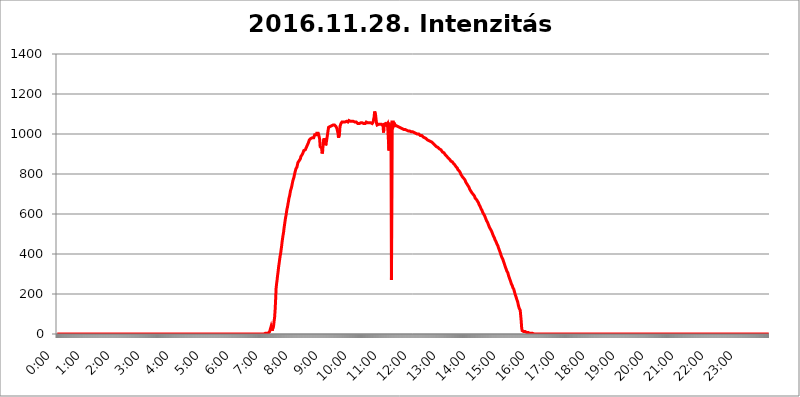
| Category | 2016.11.28. Intenzitás [W/m^2] |
|---|---|
| 0.0 | 0 |
| 0.0006944444444444445 | 0 |
| 0.001388888888888889 | 0 |
| 0.0020833333333333333 | 0 |
| 0.002777777777777778 | 0 |
| 0.003472222222222222 | 0 |
| 0.004166666666666667 | 0 |
| 0.004861111111111111 | 0 |
| 0.005555555555555556 | 0 |
| 0.0062499999999999995 | 0 |
| 0.006944444444444444 | 0 |
| 0.007638888888888889 | 0 |
| 0.008333333333333333 | 0 |
| 0.009027777777777779 | 0 |
| 0.009722222222222222 | 0 |
| 0.010416666666666666 | 0 |
| 0.011111111111111112 | 0 |
| 0.011805555555555555 | 0 |
| 0.012499999999999999 | 0 |
| 0.013194444444444444 | 0 |
| 0.013888888888888888 | 0 |
| 0.014583333333333332 | 0 |
| 0.015277777777777777 | 0 |
| 0.015972222222222224 | 0 |
| 0.016666666666666666 | 0 |
| 0.017361111111111112 | 0 |
| 0.018055555555555557 | 0 |
| 0.01875 | 0 |
| 0.019444444444444445 | 0 |
| 0.02013888888888889 | 0 |
| 0.020833333333333332 | 0 |
| 0.02152777777777778 | 0 |
| 0.022222222222222223 | 0 |
| 0.02291666666666667 | 0 |
| 0.02361111111111111 | 0 |
| 0.024305555555555556 | 0 |
| 0.024999999999999998 | 0 |
| 0.025694444444444447 | 0 |
| 0.02638888888888889 | 0 |
| 0.027083333333333334 | 0 |
| 0.027777777777777776 | 0 |
| 0.02847222222222222 | 0 |
| 0.029166666666666664 | 0 |
| 0.029861111111111113 | 0 |
| 0.030555555555555555 | 0 |
| 0.03125 | 0 |
| 0.03194444444444445 | 0 |
| 0.03263888888888889 | 0 |
| 0.03333333333333333 | 0 |
| 0.034027777777777775 | 0 |
| 0.034722222222222224 | 0 |
| 0.035416666666666666 | 0 |
| 0.036111111111111115 | 0 |
| 0.03680555555555556 | 0 |
| 0.0375 | 0 |
| 0.03819444444444444 | 0 |
| 0.03888888888888889 | 0 |
| 0.03958333333333333 | 0 |
| 0.04027777777777778 | 0 |
| 0.04097222222222222 | 0 |
| 0.041666666666666664 | 0 |
| 0.042361111111111106 | 0 |
| 0.04305555555555556 | 0 |
| 0.043750000000000004 | 0 |
| 0.044444444444444446 | 0 |
| 0.04513888888888889 | 0 |
| 0.04583333333333334 | 0 |
| 0.04652777777777778 | 0 |
| 0.04722222222222222 | 0 |
| 0.04791666666666666 | 0 |
| 0.04861111111111111 | 0 |
| 0.049305555555555554 | 0 |
| 0.049999999999999996 | 0 |
| 0.05069444444444445 | 0 |
| 0.051388888888888894 | 0 |
| 0.052083333333333336 | 0 |
| 0.05277777777777778 | 0 |
| 0.05347222222222222 | 0 |
| 0.05416666666666667 | 0 |
| 0.05486111111111111 | 0 |
| 0.05555555555555555 | 0 |
| 0.05625 | 0 |
| 0.05694444444444444 | 0 |
| 0.057638888888888885 | 0 |
| 0.05833333333333333 | 0 |
| 0.05902777777777778 | 0 |
| 0.059722222222222225 | 0 |
| 0.06041666666666667 | 0 |
| 0.061111111111111116 | 0 |
| 0.06180555555555556 | 0 |
| 0.0625 | 0 |
| 0.06319444444444444 | 0 |
| 0.06388888888888888 | 0 |
| 0.06458333333333334 | 0 |
| 0.06527777777777778 | 0 |
| 0.06597222222222222 | 0 |
| 0.06666666666666667 | 0 |
| 0.06736111111111111 | 0 |
| 0.06805555555555555 | 0 |
| 0.06874999999999999 | 0 |
| 0.06944444444444443 | 0 |
| 0.07013888888888889 | 0 |
| 0.07083333333333333 | 0 |
| 0.07152777777777779 | 0 |
| 0.07222222222222223 | 0 |
| 0.07291666666666667 | 0 |
| 0.07361111111111111 | 0 |
| 0.07430555555555556 | 0 |
| 0.075 | 0 |
| 0.07569444444444444 | 0 |
| 0.0763888888888889 | 0 |
| 0.07708333333333334 | 0 |
| 0.07777777777777778 | 0 |
| 0.07847222222222222 | 0 |
| 0.07916666666666666 | 0 |
| 0.0798611111111111 | 0 |
| 0.08055555555555556 | 0 |
| 0.08125 | 0 |
| 0.08194444444444444 | 0 |
| 0.08263888888888889 | 0 |
| 0.08333333333333333 | 0 |
| 0.08402777777777777 | 0 |
| 0.08472222222222221 | 0 |
| 0.08541666666666665 | 0 |
| 0.08611111111111112 | 0 |
| 0.08680555555555557 | 0 |
| 0.08750000000000001 | 0 |
| 0.08819444444444445 | 0 |
| 0.08888888888888889 | 0 |
| 0.08958333333333333 | 0 |
| 0.09027777777777778 | 0 |
| 0.09097222222222222 | 0 |
| 0.09166666666666667 | 0 |
| 0.09236111111111112 | 0 |
| 0.09305555555555556 | 0 |
| 0.09375 | 0 |
| 0.09444444444444444 | 0 |
| 0.09513888888888888 | 0 |
| 0.09583333333333333 | 0 |
| 0.09652777777777777 | 0 |
| 0.09722222222222222 | 0 |
| 0.09791666666666667 | 0 |
| 0.09861111111111111 | 0 |
| 0.09930555555555555 | 0 |
| 0.09999999999999999 | 0 |
| 0.10069444444444443 | 0 |
| 0.1013888888888889 | 0 |
| 0.10208333333333335 | 0 |
| 0.10277777777777779 | 0 |
| 0.10347222222222223 | 0 |
| 0.10416666666666667 | 0 |
| 0.10486111111111111 | 0 |
| 0.10555555555555556 | 0 |
| 0.10625 | 0 |
| 0.10694444444444444 | 0 |
| 0.1076388888888889 | 0 |
| 0.10833333333333334 | 0 |
| 0.10902777777777778 | 0 |
| 0.10972222222222222 | 0 |
| 0.1111111111111111 | 0 |
| 0.11180555555555556 | 0 |
| 0.11180555555555556 | 0 |
| 0.1125 | 0 |
| 0.11319444444444444 | 0 |
| 0.11388888888888889 | 0 |
| 0.11458333333333333 | 0 |
| 0.11527777777777777 | 0 |
| 0.11597222222222221 | 0 |
| 0.11666666666666665 | 0 |
| 0.1173611111111111 | 0 |
| 0.11805555555555557 | 0 |
| 0.11944444444444445 | 0 |
| 0.12013888888888889 | 0 |
| 0.12083333333333333 | 0 |
| 0.12152777777777778 | 0 |
| 0.12222222222222223 | 0 |
| 0.12291666666666667 | 0 |
| 0.12291666666666667 | 0 |
| 0.12361111111111112 | 0 |
| 0.12430555555555556 | 0 |
| 0.125 | 0 |
| 0.12569444444444444 | 0 |
| 0.12638888888888888 | 0 |
| 0.12708333333333333 | 0 |
| 0.16875 | 0 |
| 0.12847222222222224 | 0 |
| 0.12916666666666668 | 0 |
| 0.12986111111111112 | 0 |
| 0.13055555555555556 | 0 |
| 0.13125 | 0 |
| 0.13194444444444445 | 0 |
| 0.1326388888888889 | 0 |
| 0.13333333333333333 | 0 |
| 0.13402777777777777 | 0 |
| 0.13402777777777777 | 0 |
| 0.13472222222222222 | 0 |
| 0.13541666666666666 | 0 |
| 0.1361111111111111 | 0 |
| 0.13749999999999998 | 0 |
| 0.13819444444444443 | 0 |
| 0.1388888888888889 | 0 |
| 0.13958333333333334 | 0 |
| 0.14027777777777778 | 0 |
| 0.14097222222222222 | 0 |
| 0.14166666666666666 | 0 |
| 0.1423611111111111 | 0 |
| 0.14305555555555557 | 0 |
| 0.14375000000000002 | 0 |
| 0.14444444444444446 | 0 |
| 0.1451388888888889 | 0 |
| 0.1451388888888889 | 0 |
| 0.14652777777777778 | 0 |
| 0.14722222222222223 | 0 |
| 0.14791666666666667 | 0 |
| 0.1486111111111111 | 0 |
| 0.14930555555555555 | 0 |
| 0.15 | 0 |
| 0.15069444444444444 | 0 |
| 0.15138888888888888 | 0 |
| 0.15208333333333332 | 0 |
| 0.15277777777777776 | 0 |
| 0.15347222222222223 | 0 |
| 0.15416666666666667 | 0 |
| 0.15486111111111112 | 0 |
| 0.15555555555555556 | 0 |
| 0.15625 | 0 |
| 0.15694444444444444 | 0 |
| 0.15763888888888888 | 0 |
| 0.15833333333333333 | 0 |
| 0.15902777777777777 | 0 |
| 0.15972222222222224 | 0 |
| 0.16041666666666668 | 0 |
| 0.16111111111111112 | 0 |
| 0.16180555555555556 | 0 |
| 0.1625 | 0 |
| 0.16319444444444445 | 0 |
| 0.1638888888888889 | 0 |
| 0.16458333333333333 | 0 |
| 0.16527777777777777 | 0 |
| 0.16597222222222222 | 0 |
| 0.16666666666666666 | 0 |
| 0.1673611111111111 | 0 |
| 0.16805555555555554 | 0 |
| 0.16874999999999998 | 0 |
| 0.16944444444444443 | 0 |
| 0.17013888888888887 | 0 |
| 0.1708333333333333 | 0 |
| 0.17152777777777775 | 0 |
| 0.17222222222222225 | 0 |
| 0.1729166666666667 | 0 |
| 0.17361111111111113 | 0 |
| 0.17430555555555557 | 0 |
| 0.17500000000000002 | 0 |
| 0.17569444444444446 | 0 |
| 0.1763888888888889 | 0 |
| 0.17708333333333334 | 0 |
| 0.17777777777777778 | 0 |
| 0.17847222222222223 | 0 |
| 0.17916666666666667 | 0 |
| 0.1798611111111111 | 0 |
| 0.18055555555555555 | 0 |
| 0.18125 | 0 |
| 0.18194444444444444 | 0 |
| 0.1826388888888889 | 0 |
| 0.18333333333333335 | 0 |
| 0.1840277777777778 | 0 |
| 0.18472222222222223 | 0 |
| 0.18541666666666667 | 0 |
| 0.18611111111111112 | 0 |
| 0.18680555555555556 | 0 |
| 0.1875 | 0 |
| 0.18819444444444444 | 0 |
| 0.18888888888888888 | 0 |
| 0.18958333333333333 | 0 |
| 0.19027777777777777 | 0 |
| 0.1909722222222222 | 0 |
| 0.19166666666666665 | 0 |
| 0.19236111111111112 | 0 |
| 0.19305555555555554 | 0 |
| 0.19375 | 0 |
| 0.19444444444444445 | 0 |
| 0.1951388888888889 | 0 |
| 0.19583333333333333 | 0 |
| 0.19652777777777777 | 0 |
| 0.19722222222222222 | 0 |
| 0.19791666666666666 | 0 |
| 0.1986111111111111 | 0 |
| 0.19930555555555554 | 0 |
| 0.19999999999999998 | 0 |
| 0.20069444444444443 | 0 |
| 0.20138888888888887 | 0 |
| 0.2020833333333333 | 0 |
| 0.2027777777777778 | 0 |
| 0.2034722222222222 | 0 |
| 0.2041666666666667 | 0 |
| 0.20486111111111113 | 0 |
| 0.20555555555555557 | 0 |
| 0.20625000000000002 | 0 |
| 0.20694444444444446 | 0 |
| 0.2076388888888889 | 0 |
| 0.20833333333333334 | 0 |
| 0.20902777777777778 | 0 |
| 0.20972222222222223 | 0 |
| 0.21041666666666667 | 0 |
| 0.2111111111111111 | 0 |
| 0.21180555555555555 | 0 |
| 0.2125 | 0 |
| 0.21319444444444444 | 0 |
| 0.2138888888888889 | 0 |
| 0.21458333333333335 | 0 |
| 0.2152777777777778 | 0 |
| 0.21597222222222223 | 0 |
| 0.21666666666666667 | 0 |
| 0.21736111111111112 | 0 |
| 0.21805555555555556 | 0 |
| 0.21875 | 0 |
| 0.21944444444444444 | 0 |
| 0.22013888888888888 | 0 |
| 0.22083333333333333 | 0 |
| 0.22152777777777777 | 0 |
| 0.2222222222222222 | 0 |
| 0.22291666666666665 | 0 |
| 0.2236111111111111 | 0 |
| 0.22430555555555556 | 0 |
| 0.225 | 0 |
| 0.22569444444444445 | 0 |
| 0.2263888888888889 | 0 |
| 0.22708333333333333 | 0 |
| 0.22777777777777777 | 0 |
| 0.22847222222222222 | 0 |
| 0.22916666666666666 | 0 |
| 0.2298611111111111 | 0 |
| 0.23055555555555554 | 0 |
| 0.23124999999999998 | 0 |
| 0.23194444444444443 | 0 |
| 0.23263888888888887 | 0 |
| 0.2333333333333333 | 0 |
| 0.2340277777777778 | 0 |
| 0.2347222222222222 | 0 |
| 0.2354166666666667 | 0 |
| 0.23611111111111113 | 0 |
| 0.23680555555555557 | 0 |
| 0.23750000000000002 | 0 |
| 0.23819444444444446 | 0 |
| 0.2388888888888889 | 0 |
| 0.23958333333333334 | 0 |
| 0.24027777777777778 | 0 |
| 0.24097222222222223 | 0 |
| 0.24166666666666667 | 0 |
| 0.2423611111111111 | 0 |
| 0.24305555555555555 | 0 |
| 0.24375 | 0 |
| 0.24444444444444446 | 0 |
| 0.24513888888888888 | 0 |
| 0.24583333333333335 | 0 |
| 0.2465277777777778 | 0 |
| 0.24722222222222223 | 0 |
| 0.24791666666666667 | 0 |
| 0.24861111111111112 | 0 |
| 0.24930555555555556 | 0 |
| 0.25 | 0 |
| 0.25069444444444444 | 0 |
| 0.2513888888888889 | 0 |
| 0.2520833333333333 | 0 |
| 0.25277777777777777 | 0 |
| 0.2534722222222222 | 0 |
| 0.25416666666666665 | 0 |
| 0.2548611111111111 | 0 |
| 0.2555555555555556 | 0 |
| 0.25625000000000003 | 0 |
| 0.2569444444444445 | 0 |
| 0.2576388888888889 | 0 |
| 0.25833333333333336 | 0 |
| 0.2590277777777778 | 0 |
| 0.25972222222222224 | 0 |
| 0.2604166666666667 | 0 |
| 0.2611111111111111 | 0 |
| 0.26180555555555557 | 0 |
| 0.2625 | 0 |
| 0.26319444444444445 | 0 |
| 0.2638888888888889 | 0 |
| 0.26458333333333334 | 0 |
| 0.2652777777777778 | 0 |
| 0.2659722222222222 | 0 |
| 0.26666666666666666 | 0 |
| 0.2673611111111111 | 0 |
| 0.26805555555555555 | 0 |
| 0.26875 | 0 |
| 0.26944444444444443 | 0 |
| 0.2701388888888889 | 0 |
| 0.2708333333333333 | 0 |
| 0.27152777777777776 | 0 |
| 0.2722222222222222 | 0 |
| 0.27291666666666664 | 0 |
| 0.2736111111111111 | 0 |
| 0.2743055555555555 | 0 |
| 0.27499999999999997 | 0 |
| 0.27569444444444446 | 0 |
| 0.27638888888888885 | 0 |
| 0.27708333333333335 | 0 |
| 0.2777777777777778 | 0 |
| 0.27847222222222223 | 0 |
| 0.2791666666666667 | 0 |
| 0.2798611111111111 | 0 |
| 0.28055555555555556 | 0 |
| 0.28125 | 0 |
| 0.28194444444444444 | 0 |
| 0.2826388888888889 | 0 |
| 0.2833333333333333 | 0 |
| 0.28402777777777777 | 0 |
| 0.2847222222222222 | 0 |
| 0.28541666666666665 | 0 |
| 0.28611111111111115 | 0 |
| 0.28680555555555554 | 0 |
| 0.28750000000000003 | 0 |
| 0.2881944444444445 | 0 |
| 0.2888888888888889 | 0 |
| 0.28958333333333336 | 0 |
| 0.2902777777777778 | 0 |
| 0.29097222222222224 | 3.525 |
| 0.2916666666666667 | 3.525 |
| 0.2923611111111111 | 3.525 |
| 0.29305555555555557 | 3.525 |
| 0.29375 | 3.525 |
| 0.29444444444444445 | 3.525 |
| 0.2951388888888889 | 3.525 |
| 0.29583333333333334 | 3.525 |
| 0.2965277777777778 | 7.887 |
| 0.2972222222222222 | 7.887 |
| 0.29791666666666666 | 12.257 |
| 0.2986111111111111 | 16.636 |
| 0.29930555555555555 | 29.823 |
| 0.3 | 38.653 |
| 0.30069444444444443 | 29.823 |
| 0.3013888888888889 | 16.636 |
| 0.3020833333333333 | 16.636 |
| 0.30277777777777776 | 21.024 |
| 0.3034722222222222 | 43.079 |
| 0.30416666666666664 | 65.31 |
| 0.3048611111111111 | 83.205 |
| 0.3055555555555555 | 119.235 |
| 0.30624999999999997 | 169.156 |
| 0.3069444444444444 | 228.436 |
| 0.3076388888888889 | 251.251 |
| 0.30833333333333335 | 269.49 |
| 0.3090277777777778 | 292.259 |
| 0.30972222222222223 | 310.44 |
| 0.3104166666666667 | 333.113 |
| 0.3111111111111111 | 351.198 |
| 0.31180555555555556 | 369.23 |
| 0.3125 | 387.202 |
| 0.31319444444444444 | 400.638 |
| 0.3138888888888889 | 418.492 |
| 0.3145833333333333 | 436.27 |
| 0.31527777777777777 | 458.38 |
| 0.3159722222222222 | 475.972 |
| 0.31666666666666665 | 493.475 |
| 0.31736111111111115 | 506.542 |
| 0.31805555555555554 | 528.2 |
| 0.31875000000000003 | 545.416 |
| 0.3194444444444445 | 562.53 |
| 0.3201388888888889 | 579.542 |
| 0.32083333333333336 | 592.233 |
| 0.3215277777777778 | 609.062 |
| 0.32222222222222224 | 625.784 |
| 0.3229166666666667 | 634.105 |
| 0.3236111111111111 | 650.667 |
| 0.32430555555555557 | 663.019 |
| 0.325 | 679.395 |
| 0.32569444444444445 | 687.544 |
| 0.3263888888888889 | 699.717 |
| 0.32708333333333334 | 715.858 |
| 0.3277777777777778 | 719.877 |
| 0.3284722222222222 | 731.896 |
| 0.32916666666666666 | 743.859 |
| 0.3298611111111111 | 755.766 |
| 0.33055555555555555 | 767.62 |
| 0.33125 | 767.62 |
| 0.33194444444444443 | 783.342 |
| 0.3326388888888889 | 795.074 |
| 0.3333333333333333 | 806.757 |
| 0.3340277777777778 | 810.641 |
| 0.3347222222222222 | 826.123 |
| 0.3354166666666667 | 829.981 |
| 0.3361111111111111 | 833.834 |
| 0.3368055555555556 | 845.365 |
| 0.33749999999999997 | 856.855 |
| 0.33819444444444446 | 853.029 |
| 0.33888888888888885 | 860.676 |
| 0.33958333333333335 | 868.305 |
| 0.34027777777777773 | 872.114 |
| 0.34097222222222223 | 875.918 |
| 0.3416666666666666 | 887.309 |
| 0.3423611111111111 | 891.099 |
| 0.3430555555555555 | 891.099 |
| 0.34375 | 898.668 |
| 0.3444444444444445 | 898.668 |
| 0.3451388888888889 | 909.996 |
| 0.3458333333333334 | 917.534 |
| 0.34652777777777777 | 917.534 |
| 0.34722222222222227 | 917.534 |
| 0.34791666666666665 | 921.298 |
| 0.34861111111111115 | 925.06 |
| 0.34930555555555554 | 932.576 |
| 0.35000000000000003 | 936.33 |
| 0.3506944444444444 | 943.832 |
| 0.3513888888888889 | 947.58 |
| 0.3520833333333333 | 955.071 |
| 0.3527777777777778 | 962.555 |
| 0.3534722222222222 | 970.034 |
| 0.3541666666666667 | 966.295 |
| 0.3548611111111111 | 973.772 |
| 0.35555555555555557 | 977.508 |
| 0.35625 | 977.508 |
| 0.35694444444444445 | 981.244 |
| 0.3576388888888889 | 981.244 |
| 0.35833333333333334 | 981.244 |
| 0.3590277777777778 | 984.98 |
| 0.3597222222222222 | 981.244 |
| 0.36041666666666666 | 988.714 |
| 0.3611111111111111 | 996.182 |
| 0.36180555555555555 | 996.182 |
| 0.3625 | 996.182 |
| 0.36319444444444443 | 996.182 |
| 0.3638888888888889 | 1003.65 |
| 0.3645833333333333 | 999.916 |
| 0.3652777777777778 | 999.916 |
| 0.3659722222222222 | 1003.65 |
| 0.3666666666666667 | 996.182 |
| 0.3673611111111111 | 992.448 |
| 0.3680555555555556 | 973.772 |
| 0.36874999999999997 | 936.33 |
| 0.36944444444444446 | 940.082 |
| 0.37013888888888885 | 940.082 |
| 0.37083333333333335 | 928.819 |
| 0.37152777777777773 | 902.447 |
| 0.37222222222222223 | 913.766 |
| 0.3729166666666666 | 951.327 |
| 0.3736111111111111 | 970.034 |
| 0.3743055555555555 | 977.508 |
| 0.375 | 962.555 |
| 0.3756944444444445 | 977.508 |
| 0.3763888888888889 | 943.832 |
| 0.3770833333333334 | 951.327 |
| 0.37777777777777777 | 955.071 |
| 0.37847222222222227 | 951.327 |
| 0.37916666666666665 | 999.916 |
| 0.37986111111111115 | 1018.587 |
| 0.38055555555555554 | 1033.537 |
| 0.38125000000000003 | 1037.277 |
| 0.3819444444444444 | 1037.277 |
| 0.3826388888888889 | 1037.277 |
| 0.3833333333333333 | 1041.019 |
| 0.3840277777777778 | 1041.019 |
| 0.3847222222222222 | 1041.019 |
| 0.3854166666666667 | 1044.762 |
| 0.3861111111111111 | 1044.762 |
| 0.38680555555555557 | 1044.762 |
| 0.3875 | 1044.762 |
| 0.38819444444444445 | 1044.762 |
| 0.3888888888888889 | 1044.762 |
| 0.38958333333333334 | 1044.762 |
| 0.3902777777777778 | 1044.762 |
| 0.3909722222222222 | 1037.277 |
| 0.39166666666666666 | 1037.277 |
| 0.3923611111111111 | 1026.06 |
| 0.39305555555555555 | 1022.323 |
| 0.39375 | 1003.65 |
| 0.39444444444444443 | 981.244 |
| 0.3951388888888889 | 984.98 |
| 0.3958333333333333 | 999.916 |
| 0.3965277777777778 | 1037.277 |
| 0.3972222222222222 | 1041.019 |
| 0.3979166666666667 | 1052.255 |
| 0.3986111111111111 | 1052.255 |
| 0.3993055555555556 | 1059.756 |
| 0.39999999999999997 | 1056.004 |
| 0.40069444444444446 | 1059.756 |
| 0.40138888888888885 | 1059.756 |
| 0.40208333333333335 | 1063.51 |
| 0.40277777777777773 | 1063.51 |
| 0.40347222222222223 | 1059.756 |
| 0.4041666666666666 | 1063.51 |
| 0.4048611111111111 | 1063.51 |
| 0.4055555555555555 | 1063.51 |
| 0.40625 | 1059.756 |
| 0.4069444444444445 | 1059.756 |
| 0.4076388888888889 | 1059.756 |
| 0.4083333333333334 | 1059.756 |
| 0.40902777777777777 | 1067.267 |
| 0.40972222222222227 | 1067.267 |
| 0.41041666666666665 | 1067.267 |
| 0.41111111111111115 | 1063.51 |
| 0.41180555555555554 | 1067.267 |
| 0.41250000000000003 | 1067.267 |
| 0.4131944444444444 | 1063.51 |
| 0.4138888888888889 | 1067.267 |
| 0.4145833333333333 | 1067.267 |
| 0.4152777777777778 | 1063.51 |
| 0.4159722222222222 | 1063.51 |
| 0.4166666666666667 | 1059.756 |
| 0.4173611111111111 | 1059.756 |
| 0.41805555555555557 | 1059.756 |
| 0.41875 | 1059.756 |
| 0.41944444444444445 | 1059.756 |
| 0.4201388888888889 | 1056.004 |
| 0.42083333333333334 | 1056.004 |
| 0.4215277777777778 | 1052.255 |
| 0.4222222222222222 | 1056.004 |
| 0.42291666666666666 | 1052.255 |
| 0.4236111111111111 | 1052.255 |
| 0.42430555555555555 | 1056.004 |
| 0.425 | 1056.004 |
| 0.42569444444444443 | 1056.004 |
| 0.4263888888888889 | 1052.255 |
| 0.4270833333333333 | 1056.004 |
| 0.4277777777777778 | 1056.004 |
| 0.4284722222222222 | 1056.004 |
| 0.4291666666666667 | 1052.255 |
| 0.4298611111111111 | 1052.255 |
| 0.4305555555555556 | 1052.255 |
| 0.43124999999999997 | 1052.255 |
| 0.43194444444444446 | 1052.255 |
| 0.43263888888888885 | 1052.255 |
| 0.43333333333333335 | 1059.756 |
| 0.43402777777777773 | 1059.756 |
| 0.43472222222222223 | 1059.756 |
| 0.4354166666666666 | 1056.004 |
| 0.4361111111111111 | 1059.756 |
| 0.4368055555555555 | 1056.004 |
| 0.4375 | 1056.004 |
| 0.4381944444444445 | 1052.255 |
| 0.4388888888888889 | 1052.255 |
| 0.4395833333333334 | 1056.004 |
| 0.44027777777777777 | 1052.255 |
| 0.44097222222222227 | 1052.255 |
| 0.44166666666666665 | 1052.255 |
| 0.44236111111111115 | 1056.004 |
| 0.44305555555555554 | 1059.756 |
| 0.44375000000000003 | 1063.51 |
| 0.4444444444444444 | 1086.097 |
| 0.4451388888888889 | 1112.618 |
| 0.4458333333333333 | 1116.426 |
| 0.4465277777777778 | 1093.653 |
| 0.4472222222222222 | 1071.027 |
| 0.4479166666666667 | 1052.255 |
| 0.4486111111111111 | 1044.762 |
| 0.44930555555555557 | 1048.508 |
| 0.45 | 1044.762 |
| 0.45069444444444445 | 1048.508 |
| 0.4513888888888889 | 1044.762 |
| 0.45208333333333334 | 1048.508 |
| 0.4527777777777778 | 1048.508 |
| 0.4534722222222222 | 1048.508 |
| 0.45416666666666666 | 1048.508 |
| 0.4548611111111111 | 1048.508 |
| 0.45555555555555555 | 1044.762 |
| 0.45625 | 1044.762 |
| 0.45694444444444443 | 1041.019 |
| 0.4576388888888889 | 1007.383 |
| 0.4583333333333333 | 1048.508 |
| 0.4590277777777778 | 1052.255 |
| 0.4597222222222222 | 1052.255 |
| 0.4604166666666667 | 1052.255 |
| 0.4611111111111111 | 1048.508 |
| 0.4618055555555556 | 1044.762 |
| 0.46249999999999997 | 1044.762 |
| 0.46319444444444446 | 1052.255 |
| 0.46388888888888885 | 1052.255 |
| 0.46458333333333335 | 1048.508 |
| 0.46527777777777773 | 917.534 |
| 0.46597222222222223 | 1048.508 |
| 0.4666666666666666 | 1048.508 |
| 0.4673611111111111 | 1044.762 |
| 0.4680555555555555 | 1041.019 |
| 0.46875 | 269.49 |
| 0.4694444444444445 | 1059.756 |
| 0.4701388888888889 | 1056.004 |
| 0.4708333333333334 | 1059.756 |
| 0.47152777777777777 | 1059.756 |
| 0.47222222222222227 | 1048.508 |
| 0.47291666666666665 | 1056.004 |
| 0.47361111111111115 | 1041.019 |
| 0.47430555555555554 | 1044.762 |
| 0.47500000000000003 | 1044.762 |
| 0.4756944444444444 | 1041.019 |
| 0.4763888888888889 | 1041.019 |
| 0.4770833333333333 | 1037.277 |
| 0.4777777777777778 | 1037.277 |
| 0.4784722222222222 | 1033.537 |
| 0.4791666666666667 | 1033.537 |
| 0.4798611111111111 | 1033.537 |
| 0.48055555555555557 | 1029.798 |
| 0.48125 | 1029.798 |
| 0.48194444444444445 | 1029.798 |
| 0.4826388888888889 | 1029.798 |
| 0.48333333333333334 | 1026.06 |
| 0.4840277777777778 | 1026.06 |
| 0.4847222222222222 | 1022.323 |
| 0.48541666666666666 | 1022.323 |
| 0.4861111111111111 | 1022.323 |
| 0.48680555555555555 | 1022.323 |
| 0.4875 | 1022.323 |
| 0.48819444444444443 | 1022.323 |
| 0.4888888888888889 | 1022.323 |
| 0.4895833333333333 | 1022.323 |
| 0.4902777777777778 | 1018.587 |
| 0.4909722222222222 | 1014.852 |
| 0.4916666666666667 | 1014.852 |
| 0.4923611111111111 | 1014.852 |
| 0.4930555555555556 | 1011.118 |
| 0.49374999999999997 | 1011.118 |
| 0.49444444444444446 | 1014.852 |
| 0.49513888888888885 | 1011.118 |
| 0.49583333333333335 | 1011.118 |
| 0.49652777777777773 | 1011.118 |
| 0.49722222222222223 | 1011.118 |
| 0.4979166666666666 | 1011.118 |
| 0.4986111111111111 | 1011.118 |
| 0.4993055555555555 | 1007.383 |
| 0.5 | 1007.383 |
| 0.5006944444444444 | 1007.383 |
| 0.5013888888888889 | 1003.65 |
| 0.5020833333333333 | 1003.65 |
| 0.5027777777777778 | 1003.65 |
| 0.5034722222222222 | 999.916 |
| 0.5041666666666667 | 999.916 |
| 0.5048611111111111 | 999.916 |
| 0.5055555555555555 | 999.916 |
| 0.50625 | 999.916 |
| 0.5069444444444444 | 999.916 |
| 0.5076388888888889 | 996.182 |
| 0.5083333333333333 | 996.182 |
| 0.5090277777777777 | 992.448 |
| 0.5097222222222222 | 992.448 |
| 0.5104166666666666 | 992.448 |
| 0.5111111111111112 | 992.448 |
| 0.5118055555555555 | 992.448 |
| 0.5125000000000001 | 988.714 |
| 0.5131944444444444 | 984.98 |
| 0.513888888888889 | 984.98 |
| 0.5145833333333333 | 984.98 |
| 0.5152777777777778 | 981.244 |
| 0.5159722222222222 | 981.244 |
| 0.5166666666666667 | 981.244 |
| 0.517361111111111 | 977.508 |
| 0.5180555555555556 | 977.508 |
| 0.5187499999999999 | 973.772 |
| 0.5194444444444445 | 970.034 |
| 0.5201388888888888 | 970.034 |
| 0.5208333333333334 | 966.295 |
| 0.5215277777777778 | 966.295 |
| 0.5222222222222223 | 966.295 |
| 0.5229166666666667 | 966.295 |
| 0.5236111111111111 | 962.555 |
| 0.5243055555555556 | 962.555 |
| 0.525 | 962.555 |
| 0.5256944444444445 | 958.814 |
| 0.5263888888888889 | 955.071 |
| 0.5270833333333333 | 955.071 |
| 0.5277777777777778 | 951.327 |
| 0.5284722222222222 | 951.327 |
| 0.5291666666666667 | 947.58 |
| 0.5298611111111111 | 943.832 |
| 0.5305555555555556 | 943.832 |
| 0.53125 | 940.082 |
| 0.5319444444444444 | 936.33 |
| 0.5326388888888889 | 936.33 |
| 0.5333333333333333 | 936.33 |
| 0.5340277777777778 | 932.576 |
| 0.5347222222222222 | 928.819 |
| 0.5354166666666667 | 928.819 |
| 0.5361111111111111 | 925.06 |
| 0.5368055555555555 | 925.06 |
| 0.5375 | 921.298 |
| 0.5381944444444444 | 921.298 |
| 0.5388888888888889 | 917.534 |
| 0.5395833333333333 | 917.534 |
| 0.5402777777777777 | 909.996 |
| 0.5409722222222222 | 909.996 |
| 0.5416666666666666 | 909.996 |
| 0.5423611111111112 | 906.223 |
| 0.5430555555555555 | 906.223 |
| 0.5437500000000001 | 902.447 |
| 0.5444444444444444 | 894.885 |
| 0.545138888888889 | 894.885 |
| 0.5458333333333333 | 894.885 |
| 0.5465277777777778 | 887.309 |
| 0.5472222222222222 | 887.309 |
| 0.5479166666666667 | 883.516 |
| 0.548611111111111 | 879.719 |
| 0.5493055555555556 | 879.719 |
| 0.5499999999999999 | 875.918 |
| 0.5506944444444445 | 872.114 |
| 0.5513888888888888 | 868.305 |
| 0.5520833333333334 | 864.493 |
| 0.5527777777777778 | 864.493 |
| 0.5534722222222223 | 860.676 |
| 0.5541666666666667 | 860.676 |
| 0.5548611111111111 | 856.855 |
| 0.5555555555555556 | 853.029 |
| 0.55625 | 853.029 |
| 0.5569444444444445 | 849.199 |
| 0.5576388888888889 | 845.365 |
| 0.5583333333333333 | 841.526 |
| 0.5590277777777778 | 837.682 |
| 0.5597222222222222 | 837.682 |
| 0.5604166666666667 | 833.834 |
| 0.5611111111111111 | 829.981 |
| 0.5618055555555556 | 822.26 |
| 0.5625 | 822.26 |
| 0.5631944444444444 | 818.392 |
| 0.5638888888888889 | 814.519 |
| 0.5645833333333333 | 810.641 |
| 0.5652777777777778 | 806.757 |
| 0.5659722222222222 | 798.974 |
| 0.5666666666666667 | 795.074 |
| 0.5673611111111111 | 791.169 |
| 0.5680555555555555 | 787.258 |
| 0.56875 | 783.342 |
| 0.5694444444444444 | 779.42 |
| 0.5701388888888889 | 779.42 |
| 0.5708333333333333 | 775.492 |
| 0.5715277777777777 | 771.559 |
| 0.5722222222222222 | 767.62 |
| 0.5729166666666666 | 759.723 |
| 0.5736111111111112 | 759.723 |
| 0.5743055555555555 | 755.766 |
| 0.5750000000000001 | 747.834 |
| 0.5756944444444444 | 743.859 |
| 0.576388888888889 | 739.877 |
| 0.5770833333333333 | 735.89 |
| 0.5777777777777778 | 731.896 |
| 0.5784722222222222 | 723.889 |
| 0.5791666666666667 | 723.889 |
| 0.579861111111111 | 715.858 |
| 0.5805555555555556 | 715.858 |
| 0.5812499999999999 | 711.832 |
| 0.5819444444444445 | 703.762 |
| 0.5826388888888888 | 699.717 |
| 0.5833333333333334 | 699.717 |
| 0.5840277777777778 | 695.666 |
| 0.5847222222222223 | 691.608 |
| 0.5854166666666667 | 687.544 |
| 0.5861111111111111 | 679.395 |
| 0.5868055555555556 | 679.395 |
| 0.5875 | 675.311 |
| 0.5881944444444445 | 671.22 |
| 0.5888888888888889 | 671.22 |
| 0.5895833333333333 | 663.019 |
| 0.5902777777777778 | 658.909 |
| 0.5909722222222222 | 654.791 |
| 0.5916666666666667 | 646.537 |
| 0.5923611111111111 | 642.4 |
| 0.5930555555555556 | 638.256 |
| 0.59375 | 634.105 |
| 0.5944444444444444 | 625.784 |
| 0.5951388888888889 | 621.613 |
| 0.5958333333333333 | 617.436 |
| 0.5965277777777778 | 609.062 |
| 0.5972222222222222 | 604.864 |
| 0.5979166666666667 | 600.661 |
| 0.5986111111111111 | 596.45 |
| 0.5993055555555555 | 592.233 |
| 0.6 | 588.009 |
| 0.6006944444444444 | 579.542 |
| 0.6013888888888889 | 575.299 |
| 0.6020833333333333 | 566.793 |
| 0.6027777777777777 | 566.793 |
| 0.6034722222222222 | 558.261 |
| 0.6041666666666666 | 553.986 |
| 0.6048611111111112 | 545.416 |
| 0.6055555555555555 | 541.121 |
| 0.6062500000000001 | 532.513 |
| 0.6069444444444444 | 528.2 |
| 0.607638888888889 | 523.88 |
| 0.6083333333333333 | 519.555 |
| 0.6090277777777778 | 515.223 |
| 0.6097222222222222 | 510.885 |
| 0.6104166666666667 | 502.192 |
| 0.611111111111111 | 497.836 |
| 0.6118055555555556 | 489.108 |
| 0.6124999999999999 | 484.735 |
| 0.6131944444444445 | 480.356 |
| 0.6138888888888888 | 471.582 |
| 0.6145833333333334 | 471.582 |
| 0.6152777777777778 | 462.786 |
| 0.6159722222222223 | 458.38 |
| 0.6166666666666667 | 449.551 |
| 0.6173611111111111 | 449.551 |
| 0.6180555555555556 | 440.702 |
| 0.61875 | 431.833 |
| 0.6194444444444445 | 427.39 |
| 0.6201388888888889 | 418.492 |
| 0.6208333333333333 | 414.035 |
| 0.6215277777777778 | 405.108 |
| 0.6222222222222222 | 396.164 |
| 0.6229166666666667 | 391.685 |
| 0.6236111111111111 | 382.715 |
| 0.6243055555555556 | 378.224 |
| 0.625 | 373.729 |
| 0.6256944444444444 | 364.728 |
| 0.6263888888888889 | 360.221 |
| 0.6270833333333333 | 351.198 |
| 0.6277777777777778 | 342.162 |
| 0.6284722222222222 | 337.639 |
| 0.6291666666666667 | 328.584 |
| 0.6298611111111111 | 324.052 |
| 0.6305555555555555 | 314.98 |
| 0.63125 | 310.44 |
| 0.6319444444444444 | 305.898 |
| 0.6326388888888889 | 296.808 |
| 0.6333333333333333 | 287.709 |
| 0.6340277777777777 | 283.156 |
| 0.6347222222222222 | 274.047 |
| 0.6354166666666666 | 269.49 |
| 0.6361111111111112 | 260.373 |
| 0.6368055555555555 | 251.251 |
| 0.6375000000000001 | 246.689 |
| 0.6381944444444444 | 242.127 |
| 0.638888888888889 | 233 |
| 0.6395833333333333 | 228.436 |
| 0.6402777777777778 | 223.873 |
| 0.6409722222222222 | 214.746 |
| 0.6416666666666667 | 205.62 |
| 0.642361111111111 | 196.497 |
| 0.6430555555555556 | 191.937 |
| 0.6437499999999999 | 182.82 |
| 0.6444444444444445 | 173.709 |
| 0.6451388888888888 | 169.156 |
| 0.6458333333333334 | 160.056 |
| 0.6465277777777778 | 146.423 |
| 0.6472222222222223 | 137.347 |
| 0.6479166666666667 | 128.284 |
| 0.6486111111111111 | 128.284 |
| 0.6493055555555556 | 119.235 |
| 0.65 | 92.184 |
| 0.6506944444444445 | 65.31 |
| 0.6513888888888889 | 29.823 |
| 0.6520833333333333 | 16.636 |
| 0.6527777777777778 | 16.636 |
| 0.6534722222222222 | 12.257 |
| 0.6541666666666667 | 12.257 |
| 0.6548611111111111 | 12.257 |
| 0.6555555555555556 | 12.257 |
| 0.65625 | 12.257 |
| 0.6569444444444444 | 12.257 |
| 0.6576388888888889 | 12.257 |
| 0.6583333333333333 | 7.887 |
| 0.6590277777777778 | 7.887 |
| 0.6597222222222222 | 7.887 |
| 0.6604166666666667 | 7.887 |
| 0.6611111111111111 | 3.525 |
| 0.6618055555555555 | 3.525 |
| 0.6625 | 3.525 |
| 0.6631944444444444 | 3.525 |
| 0.6638888888888889 | 3.525 |
| 0.6645833333333333 | 3.525 |
| 0.6652777777777777 | 3.525 |
| 0.6659722222222222 | 3.525 |
| 0.6666666666666666 | 3.525 |
| 0.6673611111111111 | 0 |
| 0.6680555555555556 | 0 |
| 0.6687500000000001 | 0 |
| 0.6694444444444444 | 0 |
| 0.6701388888888888 | 0 |
| 0.6708333333333334 | 0 |
| 0.6715277777777778 | 0 |
| 0.6722222222222222 | 0 |
| 0.6729166666666666 | 0 |
| 0.6736111111111112 | 0 |
| 0.6743055555555556 | 0 |
| 0.6749999999999999 | 0 |
| 0.6756944444444444 | 0 |
| 0.6763888888888889 | 0 |
| 0.6770833333333334 | 0 |
| 0.6777777777777777 | 0 |
| 0.6784722222222223 | 0 |
| 0.6791666666666667 | 0 |
| 0.6798611111111111 | 0 |
| 0.6805555555555555 | 0 |
| 0.68125 | 0 |
| 0.6819444444444445 | 0 |
| 0.6826388888888889 | 0 |
| 0.6833333333333332 | 0 |
| 0.6840277777777778 | 0 |
| 0.6847222222222222 | 0 |
| 0.6854166666666667 | 0 |
| 0.686111111111111 | 0 |
| 0.6868055555555556 | 0 |
| 0.6875 | 0 |
| 0.6881944444444444 | 0 |
| 0.688888888888889 | 0 |
| 0.6895833333333333 | 0 |
| 0.6902777777777778 | 0 |
| 0.6909722222222222 | 0 |
| 0.6916666666666668 | 0 |
| 0.6923611111111111 | 0 |
| 0.6930555555555555 | 0 |
| 0.69375 | 0 |
| 0.6944444444444445 | 0 |
| 0.6951388888888889 | 0 |
| 0.6958333333333333 | 0 |
| 0.6965277777777777 | 0 |
| 0.6972222222222223 | 0 |
| 0.6979166666666666 | 0 |
| 0.6986111111111111 | 0 |
| 0.6993055555555556 | 0 |
| 0.7000000000000001 | 0 |
| 0.7006944444444444 | 0 |
| 0.7013888888888888 | 0 |
| 0.7020833333333334 | 0 |
| 0.7027777777777778 | 0 |
| 0.7034722222222222 | 0 |
| 0.7041666666666666 | 0 |
| 0.7048611111111112 | 0 |
| 0.7055555555555556 | 0 |
| 0.7062499999999999 | 0 |
| 0.7069444444444444 | 0 |
| 0.7076388888888889 | 0 |
| 0.7083333333333334 | 0 |
| 0.7090277777777777 | 0 |
| 0.7097222222222223 | 0 |
| 0.7104166666666667 | 0 |
| 0.7111111111111111 | 0 |
| 0.7118055555555555 | 0 |
| 0.7125 | 0 |
| 0.7131944444444445 | 0 |
| 0.7138888888888889 | 0 |
| 0.7145833333333332 | 0 |
| 0.7152777777777778 | 0 |
| 0.7159722222222222 | 0 |
| 0.7166666666666667 | 0 |
| 0.717361111111111 | 0 |
| 0.7180555555555556 | 0 |
| 0.71875 | 0 |
| 0.7194444444444444 | 0 |
| 0.720138888888889 | 0 |
| 0.7208333333333333 | 0 |
| 0.7215277777777778 | 0 |
| 0.7222222222222222 | 0 |
| 0.7229166666666668 | 0 |
| 0.7236111111111111 | 0 |
| 0.7243055555555555 | 0 |
| 0.725 | 0 |
| 0.7256944444444445 | 0 |
| 0.7263888888888889 | 0 |
| 0.7270833333333333 | 0 |
| 0.7277777777777777 | 0 |
| 0.7284722222222223 | 0 |
| 0.7291666666666666 | 0 |
| 0.7298611111111111 | 0 |
| 0.7305555555555556 | 0 |
| 0.7312500000000001 | 0 |
| 0.7319444444444444 | 0 |
| 0.7326388888888888 | 0 |
| 0.7333333333333334 | 0 |
| 0.7340277777777778 | 0 |
| 0.7347222222222222 | 0 |
| 0.7354166666666666 | 0 |
| 0.7361111111111112 | 0 |
| 0.7368055555555556 | 0 |
| 0.7374999999999999 | 0 |
| 0.7381944444444444 | 0 |
| 0.7388888888888889 | 0 |
| 0.7395833333333334 | 0 |
| 0.7402777777777777 | 0 |
| 0.7409722222222223 | 0 |
| 0.7416666666666667 | 0 |
| 0.7423611111111111 | 0 |
| 0.7430555555555555 | 0 |
| 0.74375 | 0 |
| 0.7444444444444445 | 0 |
| 0.7451388888888889 | 0 |
| 0.7458333333333332 | 0 |
| 0.7465277777777778 | 0 |
| 0.7472222222222222 | 0 |
| 0.7479166666666667 | 0 |
| 0.748611111111111 | 0 |
| 0.7493055555555556 | 0 |
| 0.75 | 0 |
| 0.7506944444444444 | 0 |
| 0.751388888888889 | 0 |
| 0.7520833333333333 | 0 |
| 0.7527777777777778 | 0 |
| 0.7534722222222222 | 0 |
| 0.7541666666666668 | 0 |
| 0.7548611111111111 | 0 |
| 0.7555555555555555 | 0 |
| 0.75625 | 0 |
| 0.7569444444444445 | 0 |
| 0.7576388888888889 | 0 |
| 0.7583333333333333 | 0 |
| 0.7590277777777777 | 0 |
| 0.7597222222222223 | 0 |
| 0.7604166666666666 | 0 |
| 0.7611111111111111 | 0 |
| 0.7618055555555556 | 0 |
| 0.7625000000000001 | 0 |
| 0.7631944444444444 | 0 |
| 0.7638888888888888 | 0 |
| 0.7645833333333334 | 0 |
| 0.7652777777777778 | 0 |
| 0.7659722222222222 | 0 |
| 0.7666666666666666 | 0 |
| 0.7673611111111112 | 0 |
| 0.7680555555555556 | 0 |
| 0.7687499999999999 | 0 |
| 0.7694444444444444 | 0 |
| 0.7701388888888889 | 0 |
| 0.7708333333333334 | 0 |
| 0.7715277777777777 | 0 |
| 0.7722222222222223 | 0 |
| 0.7729166666666667 | 0 |
| 0.7736111111111111 | 0 |
| 0.7743055555555555 | 0 |
| 0.775 | 0 |
| 0.7756944444444445 | 0 |
| 0.7763888888888889 | 0 |
| 0.7770833333333332 | 0 |
| 0.7777777777777778 | 0 |
| 0.7784722222222222 | 0 |
| 0.7791666666666667 | 0 |
| 0.779861111111111 | 0 |
| 0.7805555555555556 | 0 |
| 0.78125 | 0 |
| 0.7819444444444444 | 0 |
| 0.782638888888889 | 0 |
| 0.7833333333333333 | 0 |
| 0.7840277777777778 | 0 |
| 0.7847222222222222 | 0 |
| 0.7854166666666668 | 0 |
| 0.7861111111111111 | 0 |
| 0.7868055555555555 | 0 |
| 0.7875 | 0 |
| 0.7881944444444445 | 0 |
| 0.7888888888888889 | 0 |
| 0.7895833333333333 | 0 |
| 0.7902777777777777 | 0 |
| 0.7909722222222223 | 0 |
| 0.7916666666666666 | 0 |
| 0.7923611111111111 | 0 |
| 0.7930555555555556 | 0 |
| 0.7937500000000001 | 0 |
| 0.7944444444444444 | 0 |
| 0.7951388888888888 | 0 |
| 0.7958333333333334 | 0 |
| 0.7965277777777778 | 0 |
| 0.7972222222222222 | 0 |
| 0.7979166666666666 | 0 |
| 0.7986111111111112 | 0 |
| 0.7993055555555556 | 0 |
| 0.7999999999999999 | 0 |
| 0.8006944444444444 | 0 |
| 0.8013888888888889 | 0 |
| 0.8020833333333334 | 0 |
| 0.8027777777777777 | 0 |
| 0.8034722222222223 | 0 |
| 0.8041666666666667 | 0 |
| 0.8048611111111111 | 0 |
| 0.8055555555555555 | 0 |
| 0.80625 | 0 |
| 0.8069444444444445 | 0 |
| 0.8076388888888889 | 0 |
| 0.8083333333333332 | 0 |
| 0.8090277777777778 | 0 |
| 0.8097222222222222 | 0 |
| 0.8104166666666667 | 0 |
| 0.811111111111111 | 0 |
| 0.8118055555555556 | 0 |
| 0.8125 | 0 |
| 0.8131944444444444 | 0 |
| 0.813888888888889 | 0 |
| 0.8145833333333333 | 0 |
| 0.8152777777777778 | 0 |
| 0.8159722222222222 | 0 |
| 0.8166666666666668 | 0 |
| 0.8173611111111111 | 0 |
| 0.8180555555555555 | 0 |
| 0.81875 | 0 |
| 0.8194444444444445 | 0 |
| 0.8201388888888889 | 0 |
| 0.8208333333333333 | 0 |
| 0.8215277777777777 | 0 |
| 0.8222222222222223 | 0 |
| 0.8229166666666666 | 0 |
| 0.8236111111111111 | 0 |
| 0.8243055555555556 | 0 |
| 0.8250000000000001 | 0 |
| 0.8256944444444444 | 0 |
| 0.8263888888888888 | 0 |
| 0.8270833333333334 | 0 |
| 0.8277777777777778 | 0 |
| 0.8284722222222222 | 0 |
| 0.8291666666666666 | 0 |
| 0.8298611111111112 | 0 |
| 0.8305555555555556 | 0 |
| 0.8312499999999999 | 0 |
| 0.8319444444444444 | 0 |
| 0.8326388888888889 | 0 |
| 0.8333333333333334 | 0 |
| 0.8340277777777777 | 0 |
| 0.8347222222222223 | 0 |
| 0.8354166666666667 | 0 |
| 0.8361111111111111 | 0 |
| 0.8368055555555555 | 0 |
| 0.8375 | 0 |
| 0.8381944444444445 | 0 |
| 0.8388888888888889 | 0 |
| 0.8395833333333332 | 0 |
| 0.8402777777777778 | 0 |
| 0.8409722222222222 | 0 |
| 0.8416666666666667 | 0 |
| 0.842361111111111 | 0 |
| 0.8430555555555556 | 0 |
| 0.84375 | 0 |
| 0.8444444444444444 | 0 |
| 0.845138888888889 | 0 |
| 0.8458333333333333 | 0 |
| 0.8465277777777778 | 0 |
| 0.8472222222222222 | 0 |
| 0.8479166666666668 | 0 |
| 0.8486111111111111 | 0 |
| 0.8493055555555555 | 0 |
| 0.85 | 0 |
| 0.8506944444444445 | 0 |
| 0.8513888888888889 | 0 |
| 0.8520833333333333 | 0 |
| 0.8527777777777777 | 0 |
| 0.8534722222222223 | 0 |
| 0.8541666666666666 | 0 |
| 0.8548611111111111 | 0 |
| 0.8555555555555556 | 0 |
| 0.8562500000000001 | 0 |
| 0.8569444444444444 | 0 |
| 0.8576388888888888 | 0 |
| 0.8583333333333334 | 0 |
| 0.8590277777777778 | 0 |
| 0.8597222222222222 | 0 |
| 0.8604166666666666 | 0 |
| 0.8611111111111112 | 0 |
| 0.8618055555555556 | 0 |
| 0.8624999999999999 | 0 |
| 0.8631944444444444 | 0 |
| 0.8638888888888889 | 0 |
| 0.8645833333333334 | 0 |
| 0.8652777777777777 | 0 |
| 0.8659722222222223 | 0 |
| 0.8666666666666667 | 0 |
| 0.8673611111111111 | 0 |
| 0.8680555555555555 | 0 |
| 0.86875 | 0 |
| 0.8694444444444445 | 0 |
| 0.8701388888888889 | 0 |
| 0.8708333333333332 | 0 |
| 0.8715277777777778 | 0 |
| 0.8722222222222222 | 0 |
| 0.8729166666666667 | 0 |
| 0.873611111111111 | 0 |
| 0.8743055555555556 | 0 |
| 0.875 | 0 |
| 0.8756944444444444 | 0 |
| 0.876388888888889 | 0 |
| 0.8770833333333333 | 0 |
| 0.8777777777777778 | 0 |
| 0.8784722222222222 | 0 |
| 0.8791666666666668 | 0 |
| 0.8798611111111111 | 0 |
| 0.8805555555555555 | 0 |
| 0.88125 | 0 |
| 0.8819444444444445 | 0 |
| 0.8826388888888889 | 0 |
| 0.8833333333333333 | 0 |
| 0.8840277777777777 | 0 |
| 0.8847222222222223 | 0 |
| 0.8854166666666666 | 0 |
| 0.8861111111111111 | 0 |
| 0.8868055555555556 | 0 |
| 0.8875000000000001 | 0 |
| 0.8881944444444444 | 0 |
| 0.8888888888888888 | 0 |
| 0.8895833333333334 | 0 |
| 0.8902777777777778 | 0 |
| 0.8909722222222222 | 0 |
| 0.8916666666666666 | 0 |
| 0.8923611111111112 | 0 |
| 0.8930555555555556 | 0 |
| 0.8937499999999999 | 0 |
| 0.8944444444444444 | 0 |
| 0.8951388888888889 | 0 |
| 0.8958333333333334 | 0 |
| 0.8965277777777777 | 0 |
| 0.8972222222222223 | 0 |
| 0.8979166666666667 | 0 |
| 0.8986111111111111 | 0 |
| 0.8993055555555555 | 0 |
| 0.9 | 0 |
| 0.9006944444444445 | 0 |
| 0.9013888888888889 | 0 |
| 0.9020833333333332 | 0 |
| 0.9027777777777778 | 0 |
| 0.9034722222222222 | 0 |
| 0.9041666666666667 | 0 |
| 0.904861111111111 | 0 |
| 0.9055555555555556 | 0 |
| 0.90625 | 0 |
| 0.9069444444444444 | 0 |
| 0.907638888888889 | 0 |
| 0.9083333333333333 | 0 |
| 0.9090277777777778 | 0 |
| 0.9097222222222222 | 0 |
| 0.9104166666666668 | 0 |
| 0.9111111111111111 | 0 |
| 0.9118055555555555 | 0 |
| 0.9125 | 0 |
| 0.9131944444444445 | 0 |
| 0.9138888888888889 | 0 |
| 0.9145833333333333 | 0 |
| 0.9152777777777777 | 0 |
| 0.9159722222222223 | 0 |
| 0.9166666666666666 | 0 |
| 0.9173611111111111 | 0 |
| 0.9180555555555556 | 0 |
| 0.9187500000000001 | 0 |
| 0.9194444444444444 | 0 |
| 0.9201388888888888 | 0 |
| 0.9208333333333334 | 0 |
| 0.9215277777777778 | 0 |
| 0.9222222222222222 | 0 |
| 0.9229166666666666 | 0 |
| 0.9236111111111112 | 0 |
| 0.9243055555555556 | 0 |
| 0.9249999999999999 | 0 |
| 0.9256944444444444 | 0 |
| 0.9263888888888889 | 0 |
| 0.9270833333333334 | 0 |
| 0.9277777777777777 | 0 |
| 0.9284722222222223 | 0 |
| 0.9291666666666667 | 0 |
| 0.9298611111111111 | 0 |
| 0.9305555555555555 | 0 |
| 0.93125 | 0 |
| 0.9319444444444445 | 0 |
| 0.9326388888888889 | 0 |
| 0.9333333333333332 | 0 |
| 0.9340277777777778 | 0 |
| 0.9347222222222222 | 0 |
| 0.9354166666666667 | 0 |
| 0.936111111111111 | 0 |
| 0.9368055555555556 | 0 |
| 0.9375 | 0 |
| 0.9381944444444444 | 0 |
| 0.938888888888889 | 0 |
| 0.9395833333333333 | 0 |
| 0.9402777777777778 | 0 |
| 0.9409722222222222 | 0 |
| 0.9416666666666668 | 0 |
| 0.9423611111111111 | 0 |
| 0.9430555555555555 | 0 |
| 0.94375 | 0 |
| 0.9444444444444445 | 0 |
| 0.9451388888888889 | 0 |
| 0.9458333333333333 | 0 |
| 0.9465277777777777 | 0 |
| 0.9472222222222223 | 0 |
| 0.9479166666666666 | 0 |
| 0.9486111111111111 | 0 |
| 0.9493055555555556 | 0 |
| 0.9500000000000001 | 0 |
| 0.9506944444444444 | 0 |
| 0.9513888888888888 | 0 |
| 0.9520833333333334 | 0 |
| 0.9527777777777778 | 0 |
| 0.9534722222222222 | 0 |
| 0.9541666666666666 | 0 |
| 0.9548611111111112 | 0 |
| 0.9555555555555556 | 0 |
| 0.9562499999999999 | 0 |
| 0.9569444444444444 | 0 |
| 0.9576388888888889 | 0 |
| 0.9583333333333334 | 0 |
| 0.9590277777777777 | 0 |
| 0.9597222222222223 | 0 |
| 0.9604166666666667 | 0 |
| 0.9611111111111111 | 0 |
| 0.9618055555555555 | 0 |
| 0.9625 | 0 |
| 0.9631944444444445 | 0 |
| 0.9638888888888889 | 0 |
| 0.9645833333333332 | 0 |
| 0.9652777777777778 | 0 |
| 0.9659722222222222 | 0 |
| 0.9666666666666667 | 0 |
| 0.967361111111111 | 0 |
| 0.9680555555555556 | 0 |
| 0.96875 | 0 |
| 0.9694444444444444 | 0 |
| 0.970138888888889 | 0 |
| 0.9708333333333333 | 0 |
| 0.9715277777777778 | 0 |
| 0.9722222222222222 | 0 |
| 0.9729166666666668 | 0 |
| 0.9736111111111111 | 0 |
| 0.9743055555555555 | 0 |
| 0.975 | 0 |
| 0.9756944444444445 | 0 |
| 0.9763888888888889 | 0 |
| 0.9770833333333333 | 0 |
| 0.9777777777777777 | 0 |
| 0.9784722222222223 | 0 |
| 0.9791666666666666 | 0 |
| 0.9798611111111111 | 0 |
| 0.9805555555555556 | 0 |
| 0.9812500000000001 | 0 |
| 0.9819444444444444 | 0 |
| 0.9826388888888888 | 0 |
| 0.9833333333333334 | 0 |
| 0.9840277777777778 | 0 |
| 0.9847222222222222 | 0 |
| 0.9854166666666666 | 0 |
| 0.9861111111111112 | 0 |
| 0.9868055555555556 | 0 |
| 0.9874999999999999 | 0 |
| 0.9881944444444444 | 0 |
| 0.9888888888888889 | 0 |
| 0.9895833333333334 | 0 |
| 0.9902777777777777 | 0 |
| 0.9909722222222223 | 0 |
| 0.9916666666666667 | 0 |
| 0.9923611111111111 | 0 |
| 0.9930555555555555 | 0 |
| 0.99375 | 0 |
| 0.9944444444444445 | 0 |
| 0.9951388888888889 | 0 |
| 0.9958333333333332 | 0 |
| 0.9965277777777778 | 0 |
| 0.9972222222222222 | 0 |
| 0.9979166666666667 | 0 |
| 0.998611111111111 | 0 |
| 0.9993055555555556 | 0 |